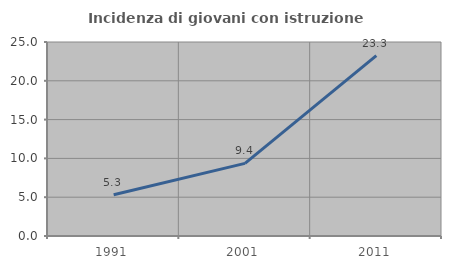
| Category | Incidenza di giovani con istruzione universitaria |
|---|---|
| 1991.0 | 5.316 |
| 2001.0 | 9.362 |
| 2011.0 | 23.256 |